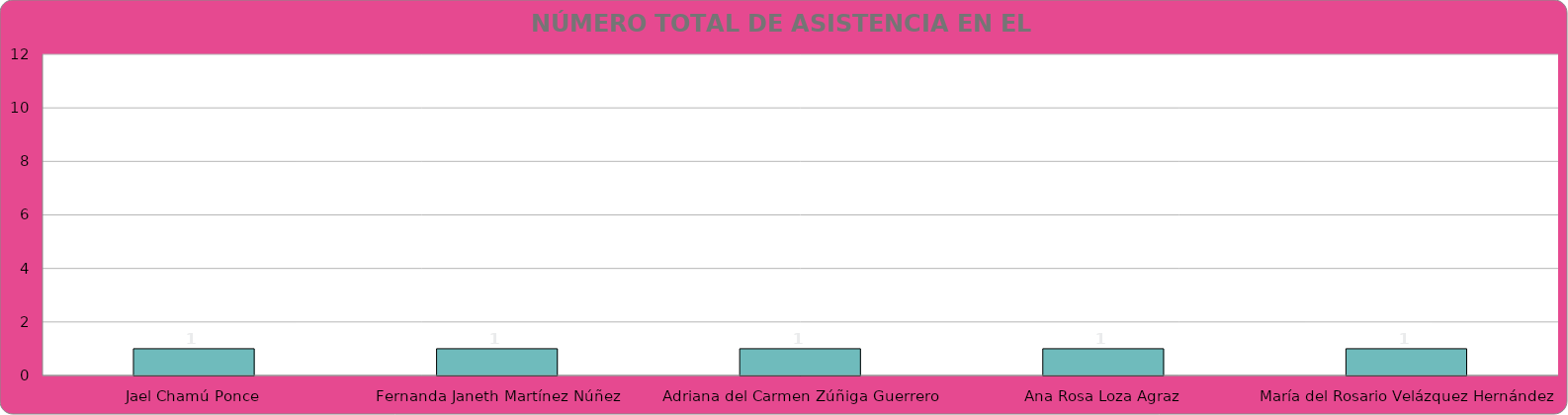
| Category | Jael Chamú Ponce Fernanda Janeth Martínez Núñez Adriana del Carmen Zúñiga Guerrero Ana Rosa Loza Agraz María del Rosario Velázquez Hernández Regidores Regidores Regidores Regidores |
|---|---|
| Jael Chamú Ponce | 1 |
| Fernanda Janeth Martínez Núñez | 1 |
| Adriana del Carmen Zúñiga Guerrero | 1 |
| Ana Rosa Loza Agraz | 1 |
| María del Rosario Velázquez Hernández | 1 |